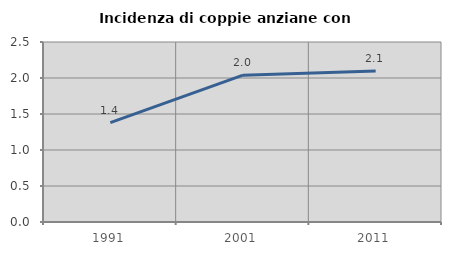
| Category | Incidenza di coppie anziane con figli |
|---|---|
| 1991.0 | 1.381 |
| 2001.0 | 2.04 |
| 2011.0 | 2.097 |